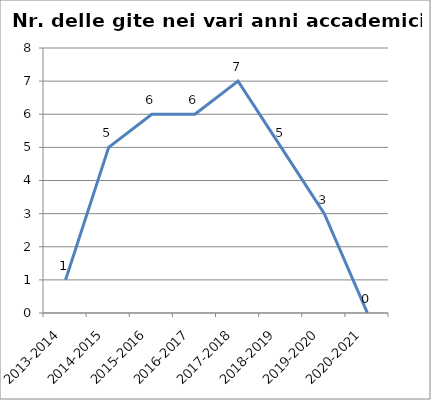
| Category | Nr. Gite Svolte |
|---|---|
| 2013-2014 | 1 |
| 2014-2015 | 5 |
| 2015-2016 | 6 |
| 2016-2017 | 6 |
| 2017-2018 | 7 |
| 2018-2019 | 5 |
| 2019-2020 | 3 |
| 2020-2021 | 0 |